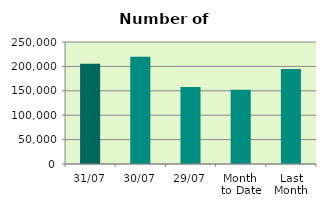
| Category | Series 0 |
|---|---|
| 31/07 | 205536 |
| 30/07 | 219632 |
| 29/07 | 157642 |
| Month 
to Date | 152026.87 |
| Last
Month | 194460.727 |